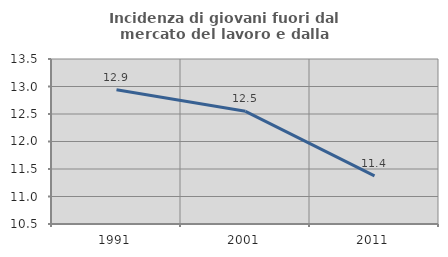
| Category | Incidenza di giovani fuori dal mercato del lavoro e dalla formazione  |
|---|---|
| 1991.0 | 12.942 |
| 2001.0 | 12.549 |
| 2011.0 | 11.374 |